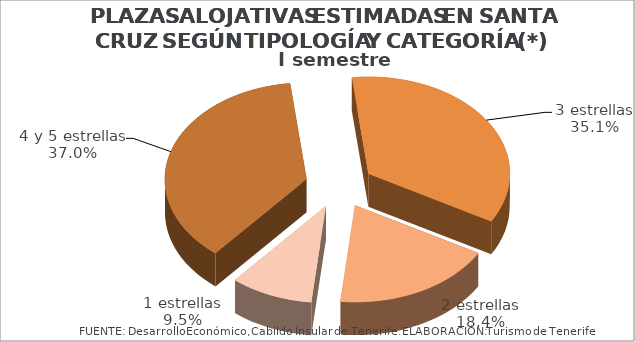
| Category | I semestre 2014 |
|---|---|
| 4 y 5 estrellas | 0.37 |
| 3 estrellas | 0.351 |
| 2 estrellas | 0.184 |
| 1 estrellas | 0.095 |